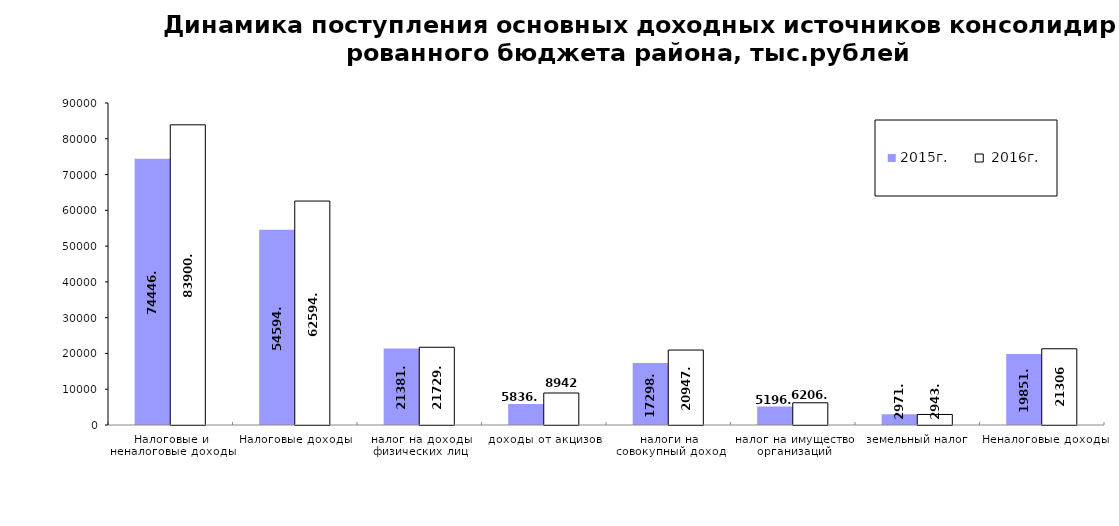
| Category | 2015г. |  2016г. |
|---|---|---|
| Налоговые и неналоговые доходы | 74446.1 | 83900.9 |
| Налоговые доходы | 54594.8 | 62594.9 |
| налог на доходы физических лиц | 21381.2 | 21729.5 |
| доходы от акцизов | 5836.8 | 8942 |
| налоги на совокупный доход | 17298.3 | 20947.5 |
| налог на имущество организаций | 5196.1 | 6206.7 |
| земельный налог | 2971.4 | 2943.2 |
| Неналоговые доходы | 19851.3 | 21306 |